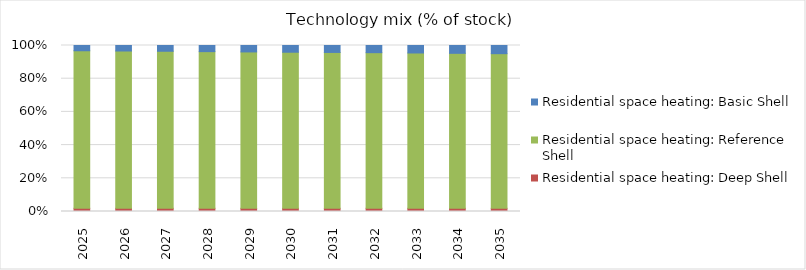
| Category | Residential space heating: Deep Shell | Residential space heating: Reference Shell | Residential space heating: Basic Shell |
|---|---|---|---|
| 2025.0 | 0.019 | 0.949 | 0.032 |
| 2026.0 | 0.019 | 0.948 | 0.033 |
| 2027.0 | 0.019 | 0.946 | 0.035 |
| 2028.0 | 0.019 | 0.944 | 0.037 |
| 2029.0 | 0.019 | 0.942 | 0.039 |
| 2030.0 | 0.019 | 0.94 | 0.041 |
| 2031.0 | 0.019 | 0.939 | 0.042 |
| 2032.0 | 0.019 | 0.938 | 0.043 |
| 2033.0 | 0.019 | 0.936 | 0.045 |
| 2034.0 | 0.019 | 0.934 | 0.047 |
| 2035.0 | 0.019 | 0.932 | 0.049 |